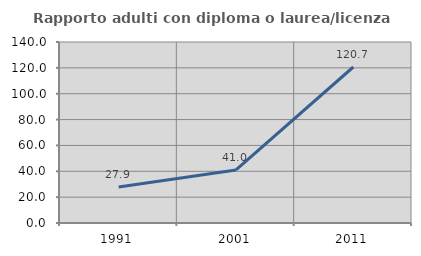
| Category | Rapporto adulti con diploma o laurea/licenza media  |
|---|---|
| 1991.0 | 27.894 |
| 2001.0 | 41.013 |
| 2011.0 | 120.662 |